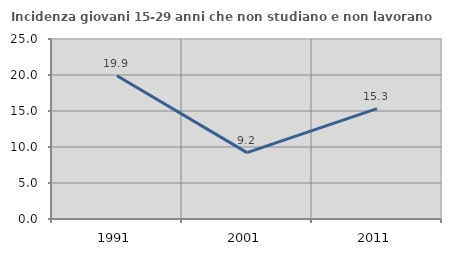
| Category | Incidenza giovani 15-29 anni che non studiano e non lavorano  |
|---|---|
| 1991.0 | 19.9 |
| 2001.0 | 9.217 |
| 2011.0 | 15.319 |